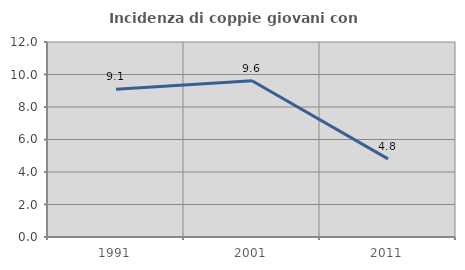
| Category | Incidenza di coppie giovani con figli |
|---|---|
| 1991.0 | 9.091 |
| 2001.0 | 9.615 |
| 2011.0 | 4.808 |